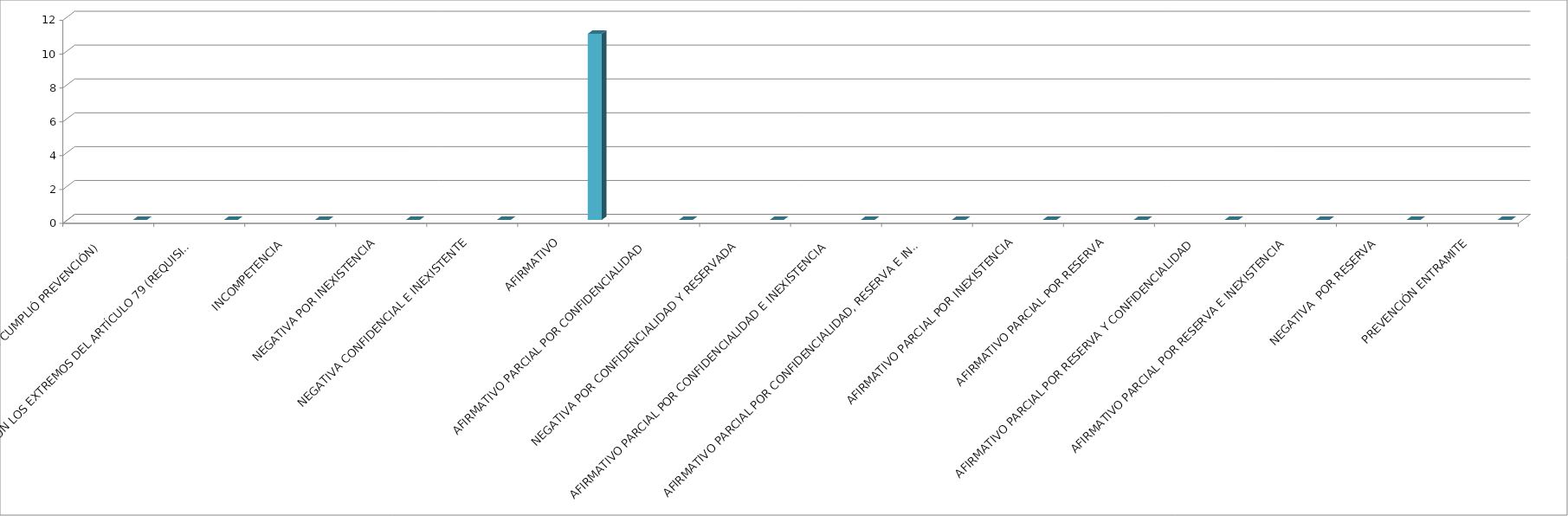
| Category | Series 0 | Series 1 | Series 2 | Series 3 | Series 4 |
|---|---|---|---|---|---|
| SE TIENE POR NO PRESENTADA ( NO CUMPLIÓ PREVENCIÓN) |  |  |  |  | 0 |
| NO CUMPLIO CON LOS EXTREMOS DEL ARTÍCULO 79 (REQUISITOS) |  |  |  |  | 0 |
| INCOMPETENCIA  |  |  |  |  | 0 |
| NEGATIVA POR INEXISTENCIA |  |  |  |  | 0 |
| NEGATIVA CONFIDENCIAL E INEXISTENTE |  |  |  |  | 0 |
| AFIRMATIVO |  |  |  |  | 11 |
| AFIRMATIVO PARCIAL POR CONFIDENCIALIDAD  |  |  |  |  | 0 |
| NEGATIVA POR CONFIDENCIALIDAD Y RESERVADA |  |  |  |  | 0 |
| AFIRMATIVO PARCIAL POR CONFIDENCIALIDAD E INEXISTENCIA |  |  |  |  | 0 |
| AFIRMATIVO PARCIAL POR CONFIDENCIALIDAD, RESERVA E INEXISTENCIA |  |  |  |  | 0 |
| AFIRMATIVO PARCIAL POR INEXISTENCIA |  |  |  |  | 0 |
| AFIRMATIVO PARCIAL POR RESERVA |  |  |  |  | 0 |
| AFIRMATIVO PARCIAL POR RESERVA Y CONFIDENCIALIDAD |  |  |  |  | 0 |
| AFIRMATIVO PARCIAL POR RESERVA E INEXISTENCIA |  |  |  |  | 0 |
| NEGATIVA  POR RESERVA |  |  |  |  | 0 |
| PREVENCIÓN ENTRAMITE |  |  |  |  | 0 |